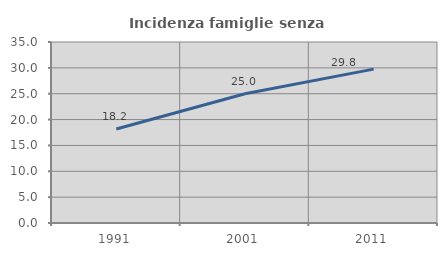
| Category | Incidenza famiglie senza nuclei |
|---|---|
| 1991.0 | 18.169 |
| 2001.0 | 25 |
| 2011.0 | 29.756 |